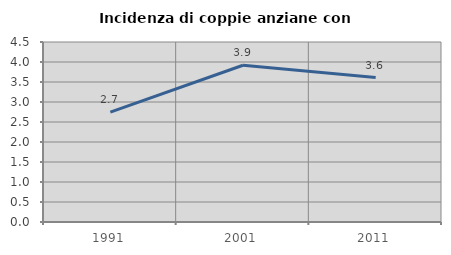
| Category | Incidenza di coppie anziane con figli |
|---|---|
| 1991.0 | 2.749 |
| 2001.0 | 3.919 |
| 2011.0 | 3.61 |